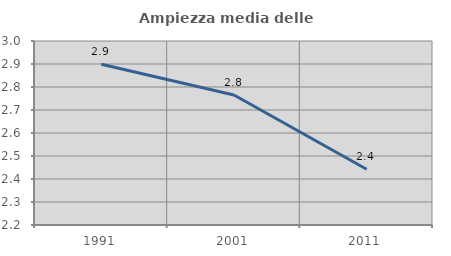
| Category | Ampiezza media delle famiglie |
|---|---|
| 1991.0 | 2.899 |
| 2001.0 | 2.765 |
| 2011.0 | 2.442 |